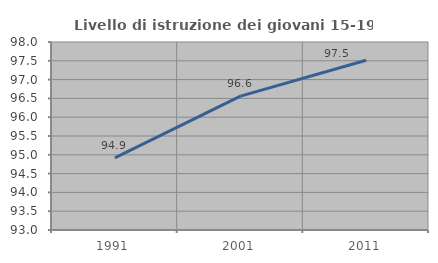
| Category | Livello di istruzione dei giovani 15-19 anni |
|---|---|
| 1991.0 | 94.919 |
| 2001.0 | 96.561 |
| 2011.0 | 97.516 |